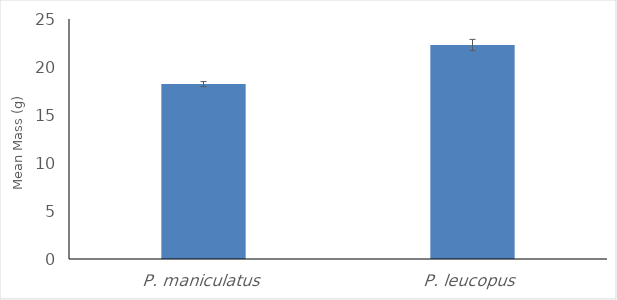
| Category | Mean Mass (g) |
|---|---|
| P. maniculatus | 18.218 |
| P. leucopus | 22.284 |